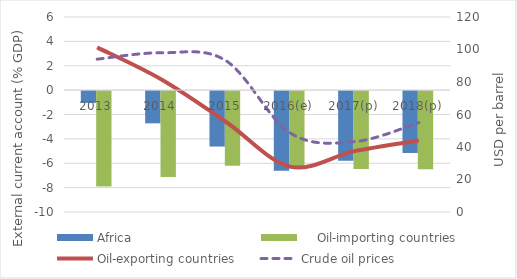
| Category | Africa |     Oil-importing countries |
|---|---|---|
| 2013 |  | -7.829 |
| 2014 |  | -7.05 |
| 2015 |  | -6.114 |
| 2016(e) |  | -6.345 |
| 2017(p) |  | -6.38 |
| 2018(p) |  | -6.42 |